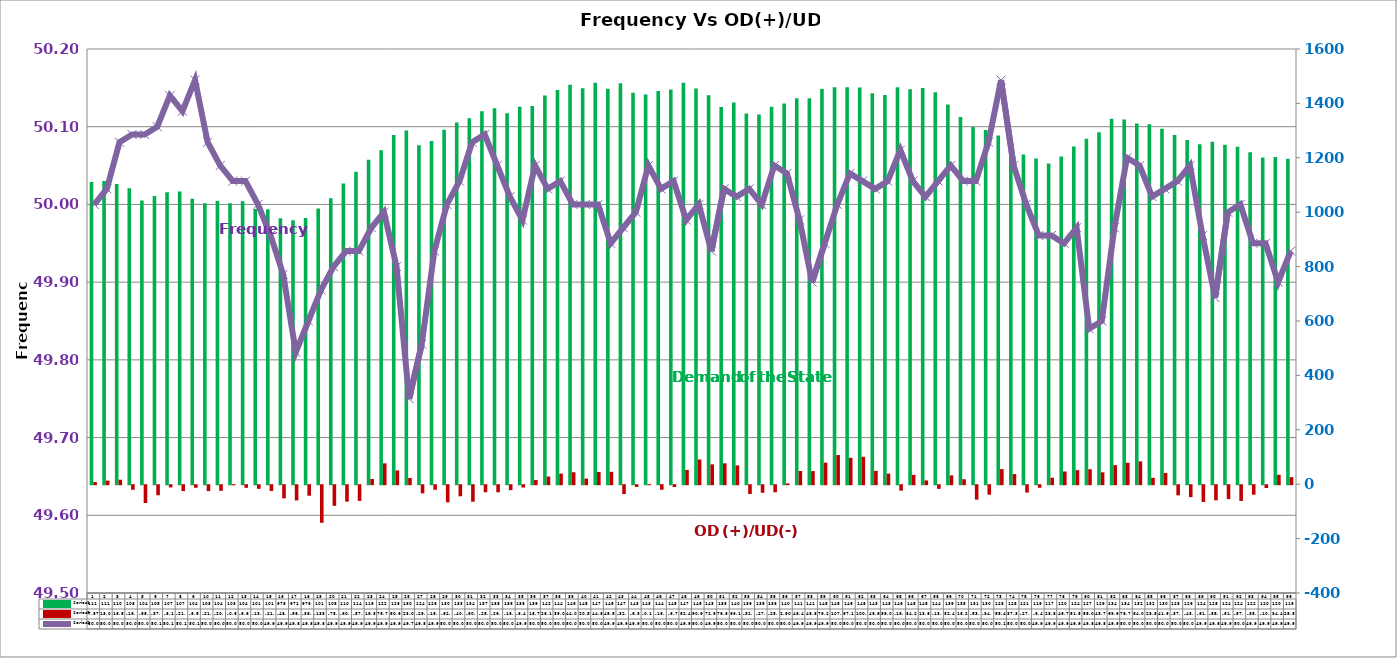
| Category | Series 2 | Series 4 |
|---|---|---|
| 0 | 1111.26 | 7.87 |
| 1 | 1114.89 | 13.08 |
| 2 | 1104.08 | 16.51 |
| 3 | 1087.8 | -16.75 |
| 4 | 1043.03 | -65.42 |
| 5 | 1059.14 | -37.03 |
| 6 | 1073.67 | -8.15 |
| 7 | 1075.94 | -21.56 |
| 8 | 1049.21 | -9.5 |
| 9 | 1032.82 | -21.72 |
| 10 | 1041.41 | -20.58 |
| 11 | 1032.47 | -0.67 |
| 12 | 1040.56 | -9.68 |
| 13 | 1012.2 | -13.35 |
| 14 | 1010.79 | -21.12 |
| 15 | 977.97 | -48.37 |
| 16 | 970.75 | -56.14 |
| 17 | 978.573 | -38.69 |
| 18 | 1013.99 | -138.12 |
| 19 | 1051.47 | -75.81 |
| 20 | 1105.61 | -60.41 |
| 21 | 1148.38 | -57.65 |
| 22 | 1192.41 | 19.3 |
| 23 | 1228.14 | 76.7 |
| 24 | 1284.05 | 50.61 |
| 25 | 1300.71 | 23.04 |
| 26 | 1246.18 | -29.94 |
| 27 | 1261.51 | -16.75 |
| 28 | 1303.12 | -62.85 |
| 29 | 1329.94 | -40.65 |
| 30 | 1345.39 | -60.76 |
| 31 | 1370.96 | -25.84 |
| 32 | 1382.04 | -26.11 |
| 33 | 1363.71 | -18.2 |
| 34 | 1387.51 | -8.49 |
| 35 | 1390.58 | 15.71 |
| 36 | 1428.81 | 28.16 |
| 37 | 1448.97 | 39.05 |
| 38 | 1468.17 | 44.03 |
| 39 | 1455.28 | 20.59 |
| 40 | 1475.96 | 44.85 |
| 41 | 1454.17 | 45.54 |
| 42 | 1474.21 | -32.26 |
| 43 | 1439.49 | -6.37 |
| 44 | 1432.46 | -0.12 |
| 45 | 1445.37 | -16.62 |
| 46 | 1451.25 | -6.77 |
| 47 | 1476.15 | 52.49 |
| 48 | 1454.57 | 90.93 |
| 49 | 1429.77 | 72.98 |
| 50 | 1386.73 | 76.81 |
| 51 | 1402.95 | 69.12 |
| 52 | 1363.01 | -32.32 |
| 53 | 1358.99 | -27.88 |
| 54 | 1388.04 | -25.87 |
| 55 | 1399.6 | 2.9 |
| 56 | 1419.19 | 48.43 |
| 57 | 1418.77 | 48.3 |
| 58 | 1452.71 | 79.29 |
| 59 | 1459.18 | 107.21 |
| 60 | 1459.51 | 97.14 |
| 61 | 1458.75 | 100.77 |
| 62 | 1437.3 | 48.91 |
| 63 | 1430.54 | 39.02 |
| 64 | 1459.74 | -19.97 |
| 65 | 1452.41 | 34.29 |
| 66 | 1456.59 | 13.8 |
| 67 | 1440.59 | -13.38 |
| 68 | 1396.24 | 32.42 |
| 69 | 1349.69 | 18.29 |
| 70 | 1313.33 | -53.07 |
| 71 | 1302.55 | -34.88 |
| 72 | 1282.07 | 55.45 |
| 73 | 1253.35 | 37.35 |
| 74 | 1212.16 | -27.07 |
| 75 | 1197.27 | -9.44 |
| 76 | 1179.41 | 23.81 |
| 77 | 1204.33 | 46.73 |
| 78 | 1241.44 | 51.57 |
| 79 | 1270.36 | 55.01 |
| 80 | 1294.34 | 43.74 |
| 81 | 1343.63 | 69.98 |
| 82 | 1341.22 | 78.76 |
| 83 | 1326.41 | 84.04 |
| 84 | 1322.92 | 23.5 |
| 85 | 1306.6 | 41.61 |
| 86 | 1283.73 | -37.2 |
| 87 | 1265.84 | -43.9 |
| 88 | 1249.46 | -61.59 |
| 89 | 1258.63 | -55.7 |
| 90 | 1248.07 | -51.06 |
| 91 | 1240.78 | -57.82 |
| 92 | 1220.34 | -35.04 |
| 93 | 1201.14 | -10.43 |
| 94 | 1202.74 | 34.48 |
| 95 | 1196.48 | 25.83 |